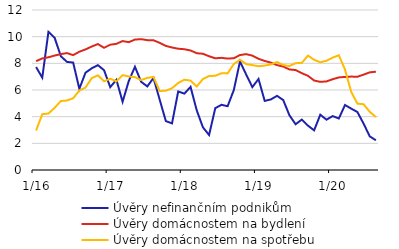
| Category | Úvěry nefinančním podnikům | Úvěry domácnostem na bydlení | Úvěry domácnostem na spotřebu |
|---|---|---|---|
|  1/16 | 7.719 | 8.163 | 2.96 |
| 2 | 6.928 | 8.368 | 4.184 |
| 3 | 10.362 | 8.454 | 4.237 |
| 4 | 9.918 | 8.583 | 4.663 |
| 5 | 8.537 | 8.692 | 5.171 |
| 6 | 8.109 | 8.768 | 5.214 |
| 7 | 8.057 | 8.617 | 5.377 |
| 8 | 6.09 | 8.871 | 5.965 |
| 9 | 7.299 | 9.044 | 6.179 |
| 10 | 7.625 | 9.26 | 6.887 |
| 11 | 7.866 | 9.446 | 7.103 |
| 12 | 7.485 | 9.166 | 6.655 |
|  1/17 | 6.213 | 9.397 | 6.847 |
| 2 | 6.765 | 9.463 | 6.648 |
| 3 | 5.115 | 9.671 | 7.111 |
| 4 | 6.673 | 9.588 | 7.018 |
| 5 | 7.74 | 9.782 | 6.965 |
| 6 | 6.618 | 9.815 | 6.745 |
| 7 | 6.269 | 9.74 | 6.909 |
| 8 | 6.902 | 9.729 | 6.978 |
| 9 | 5.281 | 9.537 | 5.921 |
| 10 | 3.669 | 9.308 | 5.949 |
| 11 | 3.496 | 9.188 | 6.133 |
| 12 | 5.891 | 9.094 | 6.528 |
|  1/18 | 5.728 | 9.059 | 6.772 |
| 2 | 6.234 | 8.964 | 6.704 |
| 3 | 4.475 | 8.76 | 6.263 |
| 4 | 3.204 | 8.718 | 6.82 |
| 5 | 2.625 | 8.532 | 7.051 |
| 6 | 4.638 | 8.379 | 7.065 |
| 7 | 4.89 | 8.413 | 7.26 |
| 8 | 4.785 | 8.355 | 7.247 |
| 9 | 5.993 | 8.384 | 7.95 |
| 10 | 8.137 | 8.622 | 8.271 |
| 11 | 7.165 | 8.691 | 7.942 |
| 12 | 6.217 | 8.578 | 7.867 |
|  1/19 | 6.825 | 8.341 | 7.783 |
| 2 | 5.184 | 8.179 | 7.832 |
| 3 | 5.293 | 8.052 | 7.921 |
| 4 | 5.561 | 7.865 | 8.096 |
| 5 | 5.245 | 7.758 | 7.872 |
| 6 | 4.106 | 7.542 | 7.8 |
| 7 | 3.433 | 7.497 | 8.014 |
| 8 | 3.78 | 7.263 | 8.026 |
| 9 | 3.328 | 7.065 | 8.582 |
| 10 | 2.975 | 6.712 | 8.265 |
| 11 | 4.148 | 6.61 | 8.079 |
| 12 | 3.774 | 6.644 | 8.193 |
|  1/20 | 4.044 | 6.808 | 8.429 |
| 2 | 3.864 | 6.944 | 8.607 |
| 3 | 4.875 | 6.98 | 7.526 |
| 4 | 4.604 | 7.006 | 5.865 |
| 5 | 4.35 | 6.994 | 4.977 |
| 6 | 3.485 | 7.153 | 4.932 |
| 7 | 2.524 | 7.323 | 4.362 |
| 8 | 2.228 | 7.373 | 3.975 |